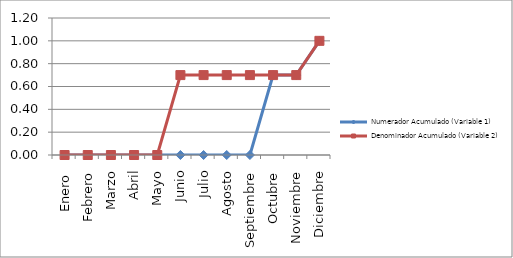
| Category | Numerador Acumulado (Variable 1) | Denominador Acumulado (Variable 2) |
|---|---|---|
| Enero  | 0 | 0 |
| Febrero | 0 | 0 |
| Marzo | 0 | 0 |
| Abril | 0 | 0 |
| Mayo | 0 | 0 |
| Junio | 0 | 0.7 |
| Julio | 0 | 0.7 |
| Agosto | 0 | 0.7 |
| Septiembre | 0 | 0.7 |
| Octubre | 0.7 | 0.7 |
| Noviembre | 0.7 | 0.7 |
| Diciembre | 1 | 1 |